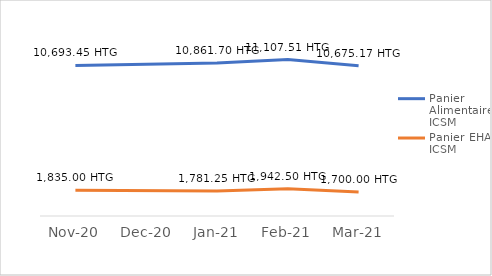
| Category | Panier Alimentaire ICSM | Panier EHA ICSM |
|---|---|---|
| 2020-11-01 | 10693.449 | 1834.996 |
| 2021-01-01 | 10861.696 | 1781.25 |
| 2021-02-01 | 11107.513 | 1942.5 |
| 2021-03-01 | 10675.169 | 1700 |